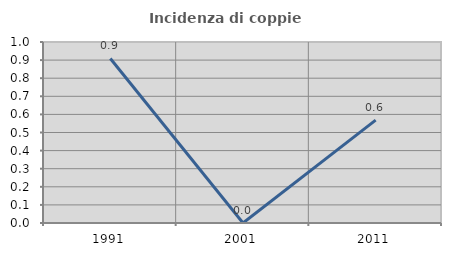
| Category | Incidenza di coppie miste |
|---|---|
| 1991.0 | 0.909 |
| 2001.0 | 0 |
| 2011.0 | 0.568 |